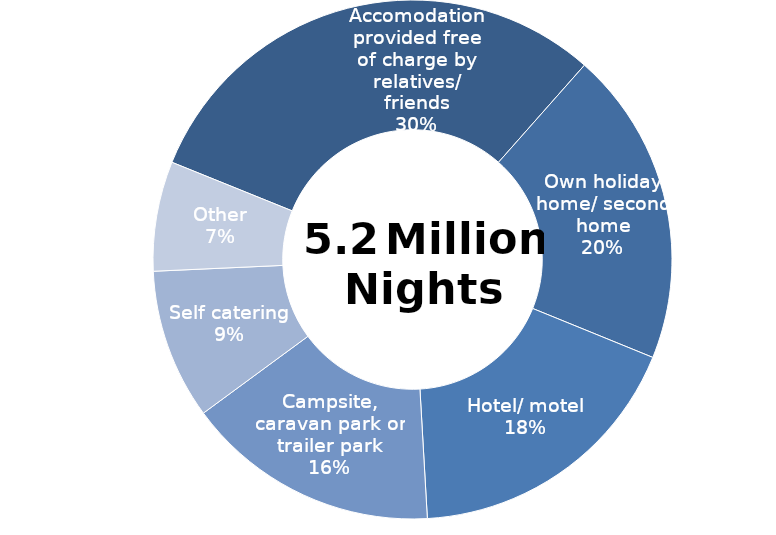
| Category | Series 0 |
|---|---|
| Accomodation provided free of charge by relatives/ friends | 1587956.494 |
| Own holiday home/ second home | 1024734.14 |
| Hotel/ motel | 935980.699 |
| Campsite, caravan park or trailer park | 826291.23 |
| Self catering | 488722.941 |
| Other | 356749.281 |